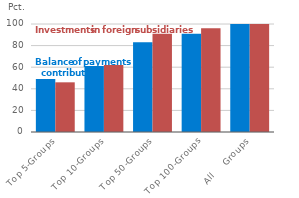
| Category | Series 0 | Series 1 |
|---|---|---|
| Top 5-Groups | 49 | 46 |
| Top 10-Groups | 61 | 62 |
| Top 50-Groups | 83 | 91 |
| Top 100-Groups | 91 | 96 |
| All     Groups | 100 | 100 |